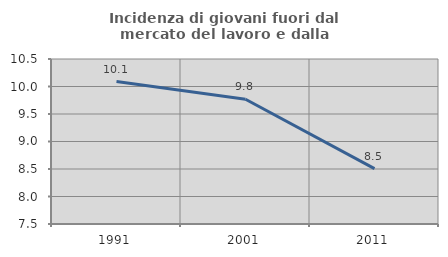
| Category | Incidenza di giovani fuori dal mercato del lavoro e dalla formazione  |
|---|---|
| 1991.0 | 10.089 |
| 2001.0 | 9.769 |
| 2011.0 | 8.506 |